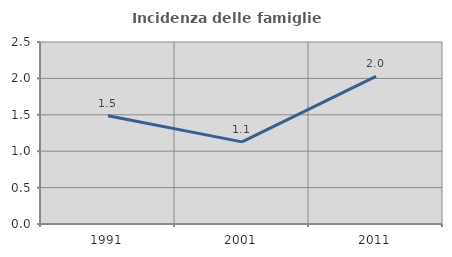
| Category | Incidenza delle famiglie numerose |
|---|---|
| 1991.0 | 1.488 |
| 2001.0 | 1.128 |
| 2011.0 | 2.028 |